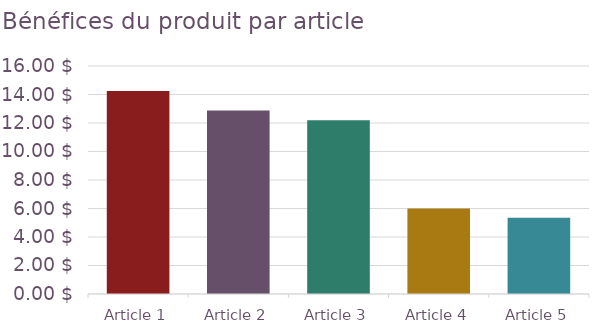
| Category | Bénéfices par article 
(expédition incluse) |
|---|---|
| Article 1 | 14.25 |
| Article 2 | 12.875 |
| Article 3 | 12.2 |
| Article 4 | 6 |
| Article 5 | 5.35 |